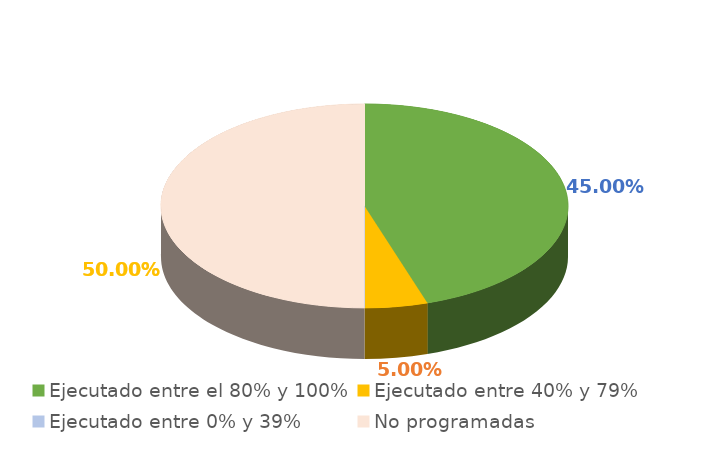
| Category | Series 0 |
|---|---|
| Ejecutado entre el 80% y 100% | 0.45 |
| Ejecutado entre 40% y 79% | 0.05 |
| Ejecutado entre 0% y 39% | 0 |
| No programadas | 0.5 |